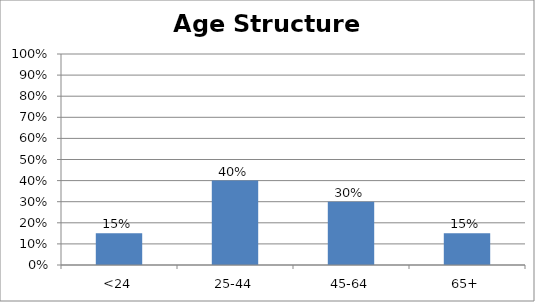
| Category | Series 0 |
|---|---|
| <24 | 0.15 |
| 25-44 | 0.4 |
| 45-64 | 0.3 |
| 65+ | 0.15 |